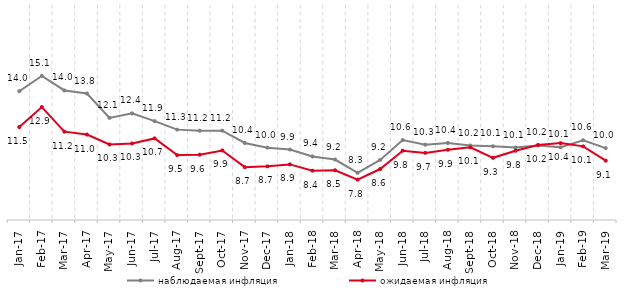
| Category | наблюдаемая инфляция | ожидаемая инфляция |
|---|---|---|
| 2017-01-01 | 13.983 | 11.486 |
| 2017-02-01 | 15.056 | 12.879 |
| 2017-03-01 | 14.037 | 11.162 |
| 2017-04-01 | 13.824 | 10.959 |
| 2017-05-01 | 12.123 | 10.27 |
| 2017-06-01 | 12.44 | 10.34 |
| 2017-07-01 | 11.9 | 10.692 |
| 2017-08-01 | 11.305 | 9.527 |
| 2017-09-01 | 11.229 | 9.556 |
| 2017-10-01 | 11.232 | 9.85 |
| 2017-11-01 | 10.372 | 8.687 |
| 2017-12-01 | 10.047 | 8.742 |
| 2018-01-01 | 9.916 | 8.879 |
| 2018-02-01 | 9.433 | 8.44 |
| 2018-03-01 | 9.218 | 8.469 |
| 2018-04-01 | 8.292 | 7.814 |
| 2018-05-01 | 9.192 | 8.556 |
| 2018-06-01 | 10.578 | 9.837 |
| 2018-07-01 | 10.255 | 9.682 |
| 2018-08-01 | 10.378 | 9.901 |
| 2018-09-01 | 10.196 | 10.07 |
| 2018-10-01 | 10.143 | 9.339 |
| 2018-11-01 | 10.053 | 9.831 |
| 2018-12-01 | 10.205 | 10.236 |
| 2019-01-01 | 10.071 | 10.363 |
| 2019-02-01 | 10.567 | 10.136 |
| 2019-03-01 | 10.013 | 9.141 |